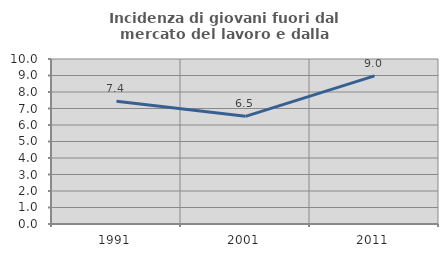
| Category | Incidenza di giovani fuori dal mercato del lavoro e dalla formazione  |
|---|---|
| 1991.0 | 7.437 |
| 2001.0 | 6.526 |
| 2011.0 | 8.974 |